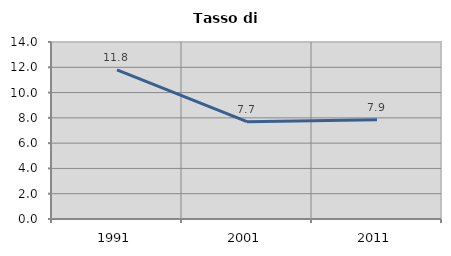
| Category | Tasso di disoccupazione   |
|---|---|
| 1991.0 | 11.797 |
| 2001.0 | 7.701 |
| 2011.0 | 7.854 |